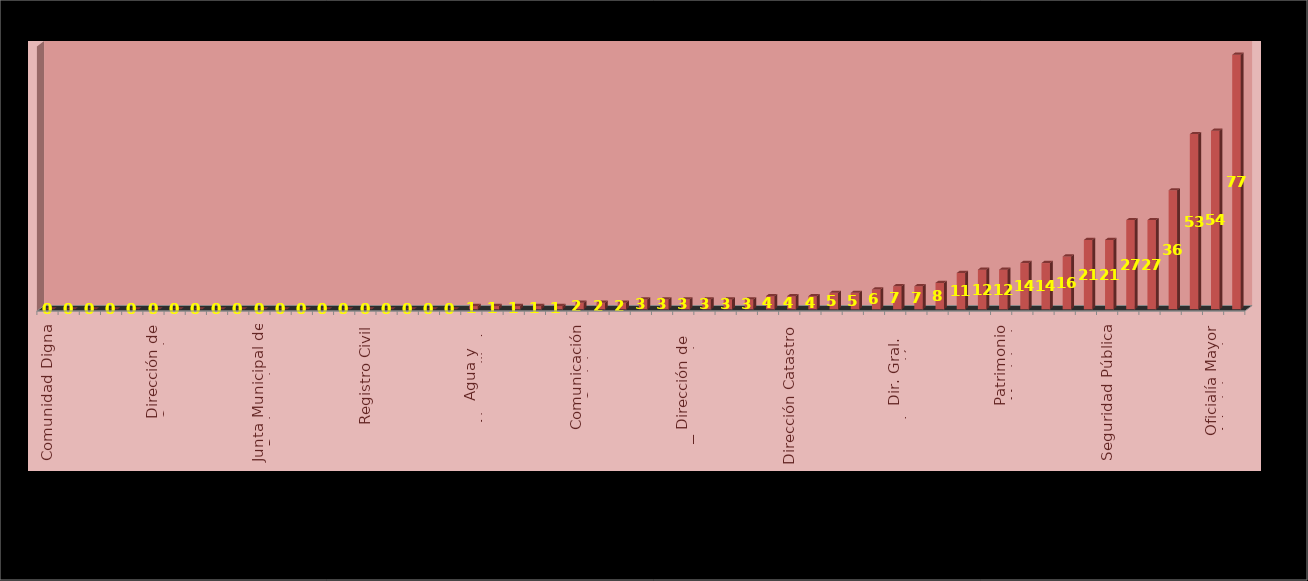
| Category | Series 0 | Series 1 |
|---|---|---|
| Comunidad Digna |  | 0 |
| Coordinación de Delegaciones |  | 0 |
| Coordinación de la Oficina de Presidencia  |  | 0 |
| Coordinación de Gabinete |  | 0 |
| Coordinación General  Oficina Central de Gobierno, Estrategía y opinión Pública |  | 0 |
| Dirección de Cementerios |  | 0 |
| Dirección General de Ecología y fomento Agropecuario |  | 0 |
| Dirección de Protección al Medio Ambiente |  | 0 |
| Instituto Municipal de la Juventud |  | 0 |
| Instituto Municipal de la Mujer |  | 0 |
| Junta Municipal de Reclutamiento |  | 0 |
| Mantenimiento Urbano |  | 0 |
| Rastros Municipales |  | 0 |
| Recursos Humanos |  | 0 |
| Regidores |  | 0 |
| Registro Civil |  | 0 |
| Relaciones Exteriores |  | 0 |
| Relaciones Públicas |  | 0 |
| Sanidad Animal |  | 0 |
| Vinculación Asuntos Religiosos |  | 0 |
| Agua y Alcantarillado |  | 1 |
| Atención Ciudadana |  | 1 |
| Coplademun |  | 1 |
| Mantenimiento de Pavimentos |  | 1 |
| Secretaria del Ayuntamiento |  | 1 |
| Comunicación Social |  | 2 |
| Educación Municipal |  | 2 |
| Instituto de Cultura |  | 2 |
| Dirección de Aseo Público |  | 3 |
| Dirección de Parques y Jardines |  | 3 |
| Dirección de Transparencia y Acceso a la Información |  | 3 |
| Instituto de Capacitación y Oferta Educativa |  | 3 |
| Integración y Dictaminación |  | 3 |
| Proyectos Estratégicos |  | 3 |
| Asuntos Internos |  | 4 |
| Dirección Catastro |  | 4 |
| Estacionómetros y Estacionamientos |  | 4 |
| Contraloría |  | 5 |
| Secretaría Particular |  | 5 |
| Alumbrado Público |  | 6 |
| Dir. Gral. Innovación y Tecnología |  | 7 |
| Participación Ciudadana |  | 7 |
| Archivo Municipal |  | 8 |
| Dir. Gral. Promoción Económica y T. |  | 11 |
| Dir. General y Admva. Ecología |  | 12 |
| Patrimonio Municipal |  | 12 |
| Dir. Gral. de Servicios Públicos |  | 14 |
| Protección Civil y Bomberos |  | 14 |
| Desarrollo Social Humano |  | 16 |
| Actas y Acuerdos |  | 21 |
| Seguridad Pública |  | 21 |
| Inspección de Reglamentos |  | 27 |
| Síndico Municipal |  | 27 |
| Padrón y Licencias |  | 36 |
| Tesorero Municipal |  | 53 |
| Oficialía Mayor Administrativa |  | 54 |
| Obras Públicas |  | 77 |